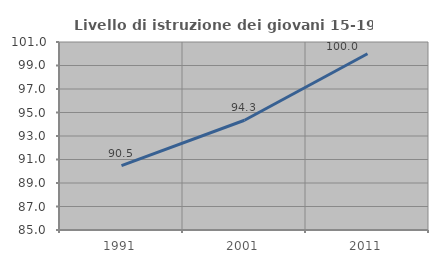
| Category | Livello di istruzione dei giovani 15-19 anni |
|---|---|
| 1991.0 | 90.476 |
| 2001.0 | 94.34 |
| 2011.0 | 100 |